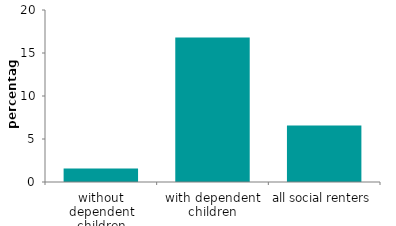
| Category | Series 0 |
|---|---|
| without dependent children | 1.564 |
| with dependent children | 16.815 |
| all social renters | 6.58 |